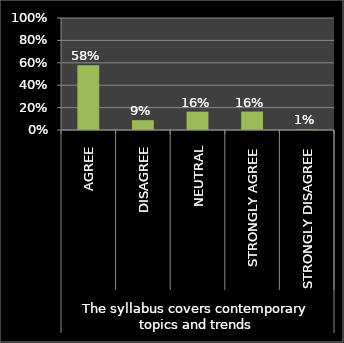
| Category | Series 0 |
|---|---|
| 0 | 0.578 |
| 1 | 0.088 |
| 2 | 0.164 |
| 3 | 0.165 |
| 4 | 0.006 |